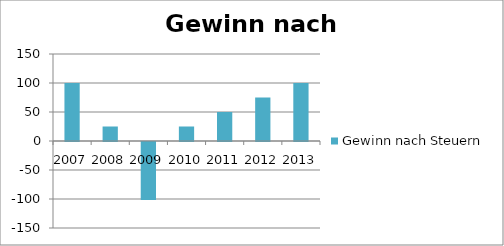
| Category | Gewinn nach Steuern |
|---|---|
| 2007.0 | 100 |
| 2008.0 | 25 |
| 2009.0 | -100 |
| 2010.0 | 25 |
| 2011.0 | 50 |
| 2012.0 | 75 |
| 2013.0 | 100 |